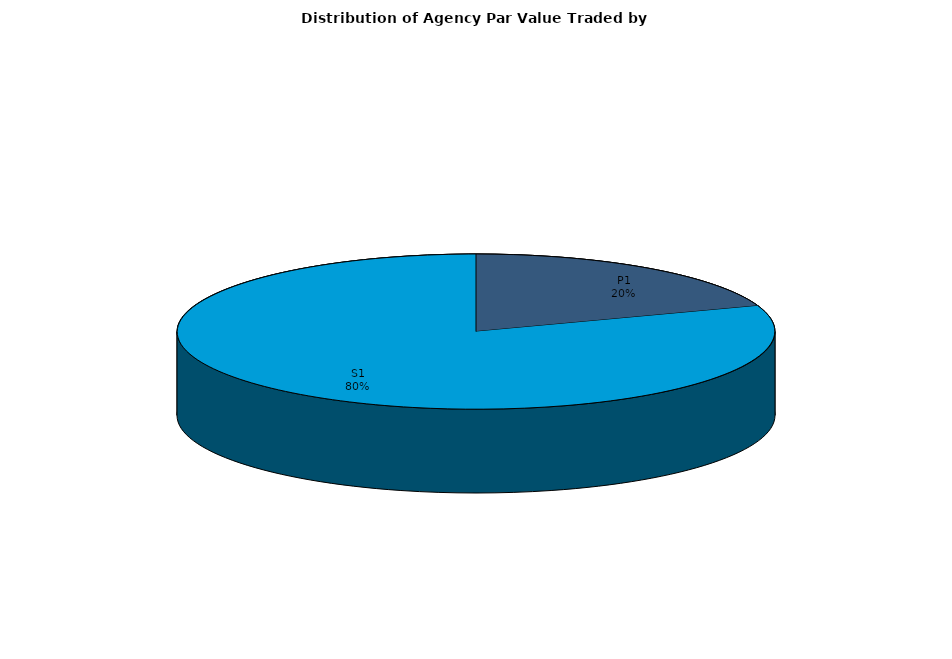
| Category | Series 0 |
|---|---|
| P1 | 955609436.13 |
| S1 | 3919215611.215 |